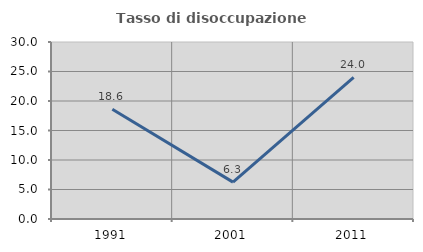
| Category | Tasso di disoccupazione giovanile  |
|---|---|
| 1991.0 | 18.605 |
| 2001.0 | 6.25 |
| 2011.0 | 24 |